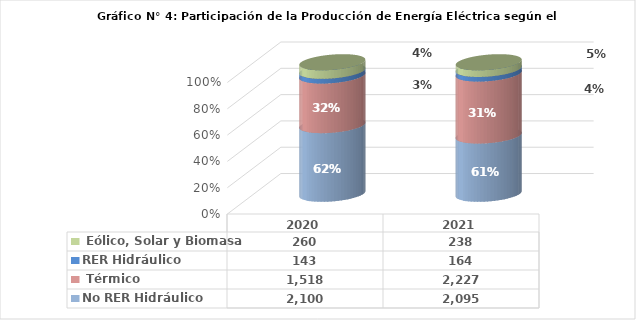
| Category | No RER | RER |
|---|---|---|
| 2020.0 | 1517.998 | 259.97 |
| 2021.0 | 2226.843 | 238.173 |